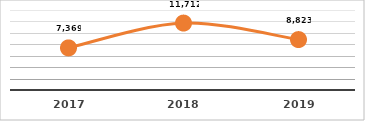
| Category | SERVICIOS TECNOLÓGICOS PROPORCIONADOS |
|---|---|
| 2017.0 | 7369 |
| 2018.0 | 11712 |
| 2019.0 | 8823 |